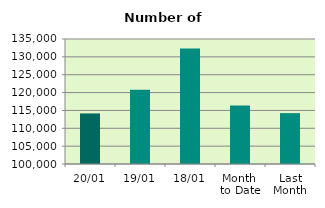
| Category | Series 0 |
|---|---|
| 20/01 | 114158 |
| 19/01 | 120798 |
| 18/01 | 132372 |
| Month 
to Date | 116375.867 |
| Last
Month | 114251.429 |